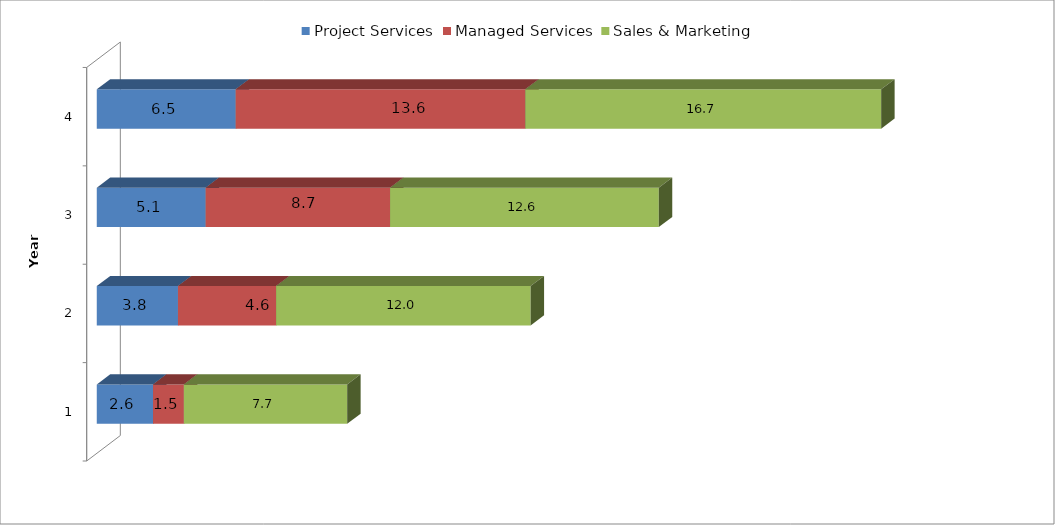
| Category | Project Services | Managed Services | Sales & Marketing |
|---|---|---|---|
| 1.0 | 2.647 | 1.452 | 7.684 |
| 2.0 | 3.821 | 4.618 | 11.978 |
| 3.0 | 5.126 | 8.677 | 12.646 |
| 4.0 | 6.538 | 13.63 | 16.745 |